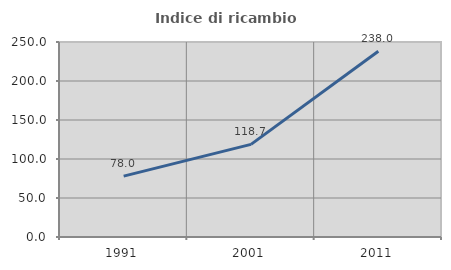
| Category | Indice di ricambio occupazionale  |
|---|---|
| 1991.0 | 77.989 |
| 2001.0 | 118.702 |
| 2011.0 | 238.035 |